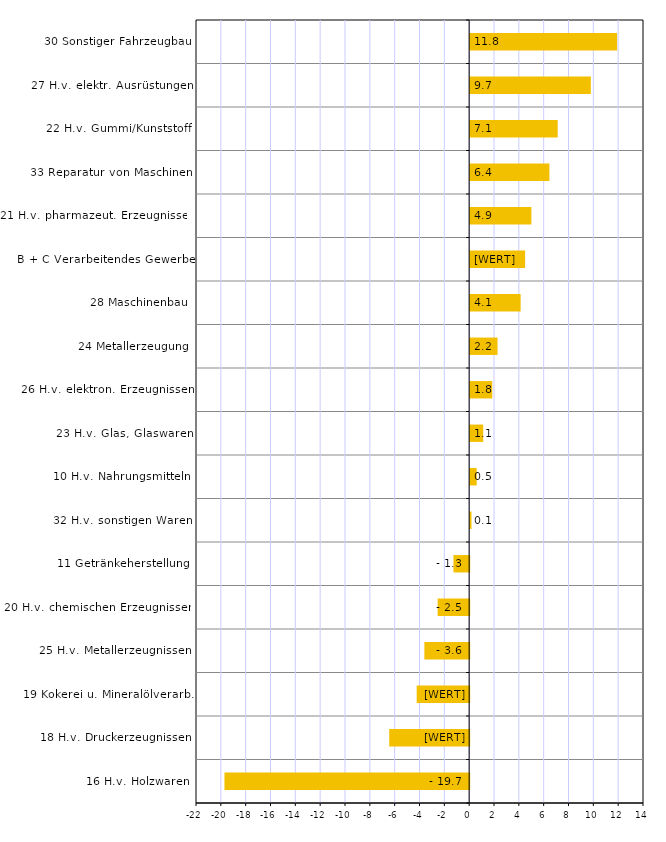
| Category | Series 0 |
|---|---|
| 16 H.v. Holzwaren | -19.708 |
| 18 H.v. Druckerzeugnissen | -6.437 |
| 19 Kokerei u. Mineralölverarb. | -4.226 |
| 25 H.v. Metallerzeugnissen | -3.609 |
| 20 H.v. chemischen Erzeugnissen | -2.538 |
| 11 Getränkeherstellung | -1.266 |
| 32 H.v. sonstigen Waren | 0.107 |
| 10 H.v. Nahrungsmitteln | 0.526 |
| 23 H.v. Glas, Glaswaren | 1.05 |
| 26 H.v. elektron. Erzeugnissen | 1.778 |
| 24 Metallerzeugung | 2.205 |
| 28 Maschinenbau | 4.065 |
| B + C Verarbeitendes Gewerbe | 4.425 |
| 21 H.v. pharmazeut. Erzeugnissen | 4.932 |
| 33 Reparatur von Maschinen | 6.382 |
| 22 H.v. Gummi/Kunststoff | 7.05 |
| 27 H.v. elektr. Ausrüstungen | 9.719 |
| 30 Sonstiger Fahrzeugbau | 11.837 |